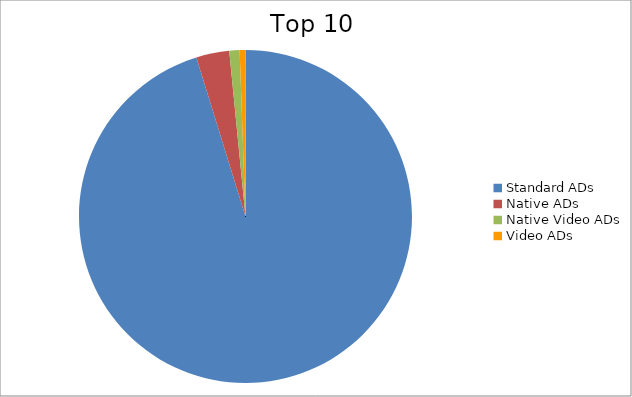
| Category | Series 0 |
|---|---|
| Standard ADs | 95.23 |
| Native ADs | 3.21 |
| Native Video ADs | 1 |
| Video ADs | 0.56 |